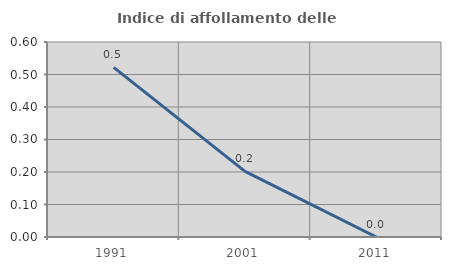
| Category | Indice di affollamento delle abitazioni  |
|---|---|
| 1991.0 | 0.522 |
| 2001.0 | 0.202 |
| 2011.0 | 0 |